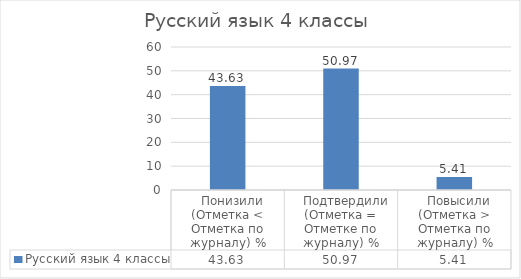
| Category | Русский язык 4 классы |
|---|---|
|   Понизили (Отметка < Отметка по журналу) % | 43.63 |
|   Подтвердили (Отметка = Отметке по журналу) % | 50.97 |
|   Повысили (Отметка > Отметка по журналу) % | 5.41 |